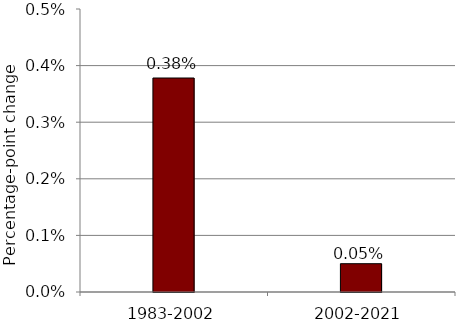
| Category | Differential |
|---|---|
| 1983-2002 | 0.004 |
| 2002-2021 | 0 |